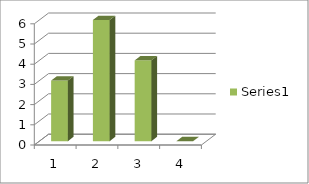
| Category | Series 0 |
|---|---|
| 0 | 3 |
| 1 | 6 |
| 2 | 4 |
| 3 | 0 |